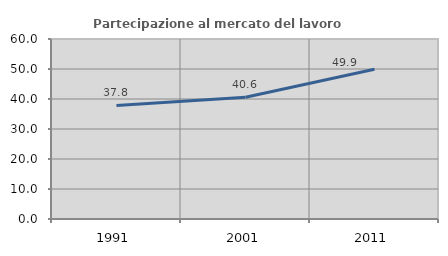
| Category | Partecipazione al mercato del lavoro  femminile |
|---|---|
| 1991.0 | 37.838 |
| 2001.0 | 40.606 |
| 2011.0 | 49.899 |